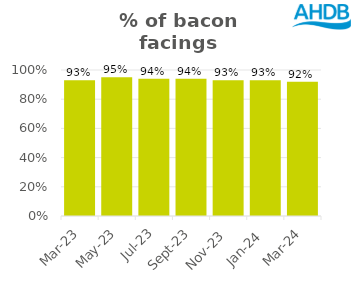
| Category | Bacon |
|---|---|
| 2023-03-01 | 0.93 |
| 2023-05-01 | 0.95 |
| 2023-07-01 | 0.94 |
| 2023-09-01 | 0.94 |
| 2023-11-01 | 0.93 |
| 2024-01-01 | 0.93 |
| 2024-03-01 | 0.92 |